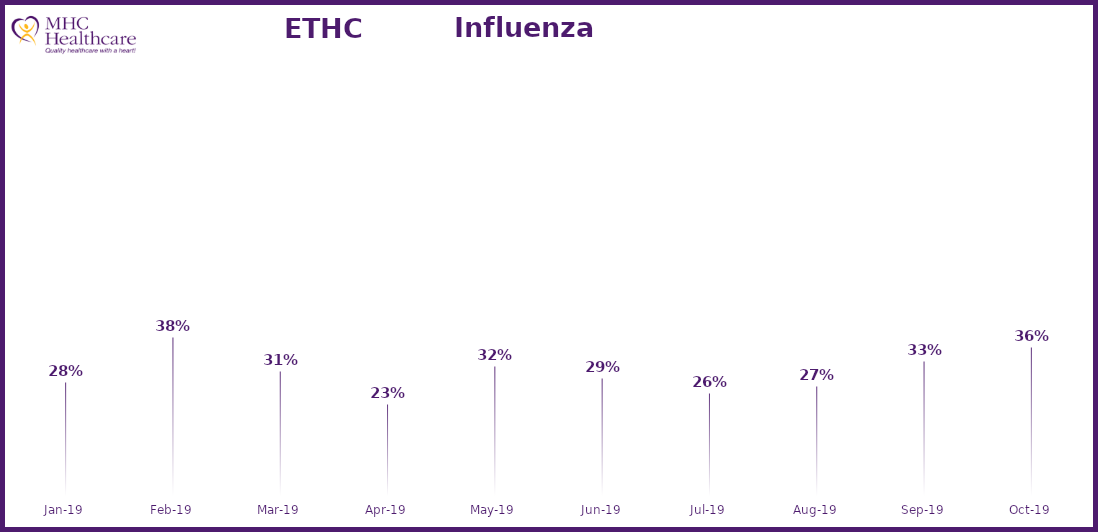
| Category | Online Access to Health Information |
|---|---|
| 2019-01-01 | 0.281 |
| 2019-02-01 | 0.382 |
| 2019-03-01 | 0.307 |
| 2019-04-01 | 0.233 |
| 2019-05-01 | 0.318 |
| 2019-06-01 | 0.29 |
| 2019-07-01 | 0.256 |
| 2019-08-01 | 0.272 |
| 2019-09-01 | 0.329 |
| 2019-10-01 | 0.36 |